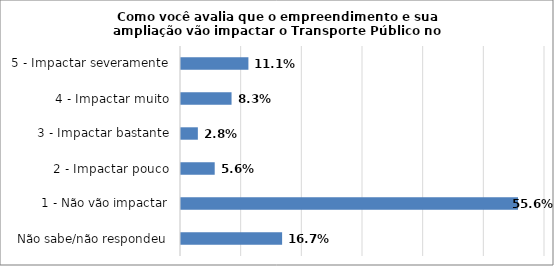
| Category | Series 0 |
|---|---|
| Não sabe/não respondeu | 0.167 |
| 1 - Não vão impactar | 0.556 |
| 2 - Impactar pouco | 0.056 |
| 3 - Impactar bastante | 0.028 |
| 4 - Impactar muito | 0.083 |
| 5 - Impactar severamente | 0.111 |